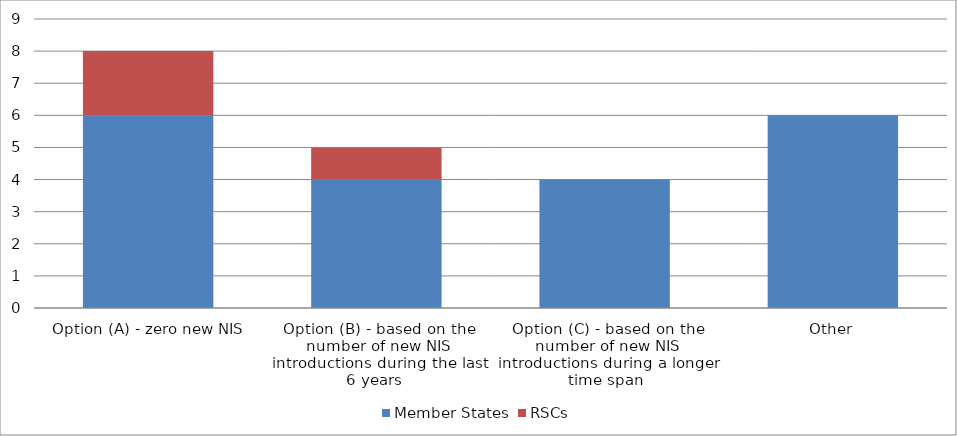
| Category | Member States | RSCs |
|---|---|---|
| Option (A) - zero new NIS | 6 | 2 |
| Option (B) - based on the number of new NIS introductions during the last 6 years  | 4 | 1 |
| Option (C) - based on the number of new NIS introductions during a longer time span | 4 | 0 |
| Other | 6 | 0 |